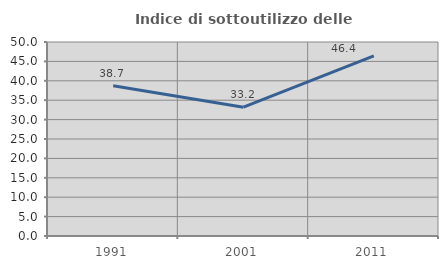
| Category | Indice di sottoutilizzo delle abitazioni  |
|---|---|
| 1991.0 | 38.74 |
| 2001.0 | 33.2 |
| 2011.0 | 46.445 |